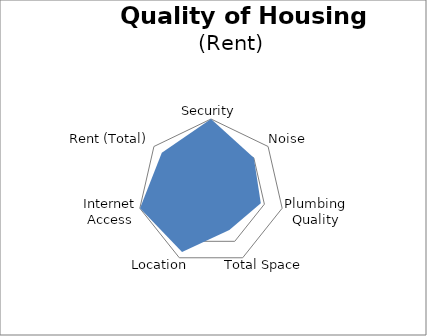
| Category | Rental Ranking |
|---|---|
| Security | 100 |
| Noise | 75 |
| Plumbing Quality | 70 |
| Total Space | 57.965 |
| Location | 91.393 |
| Internet Access | 99.734 |
| Rent (Total) | 86.207 |